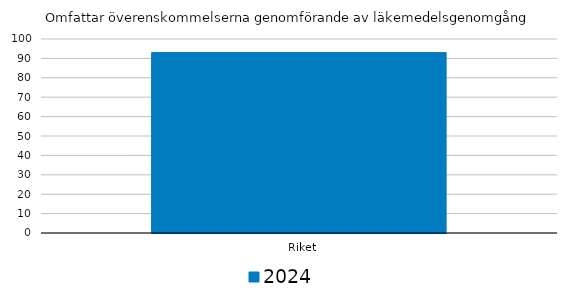
| Category | 2024 |
|---|---|
|   Riket | 93 |